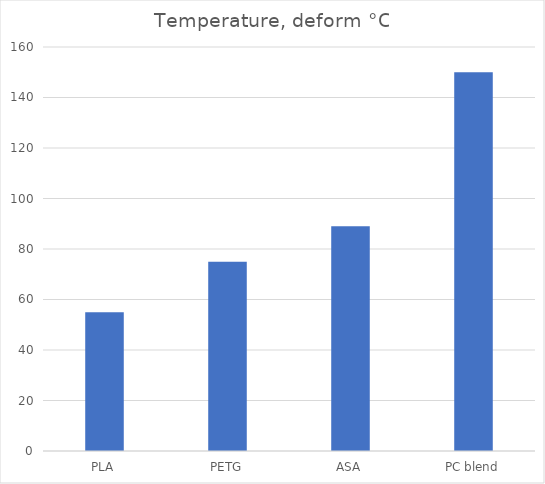
| Category | Deform °C |
|---|---|
| PLA | 55 |
| PETG | 75 |
| ASA | 89 |
| PC blend | 150 |